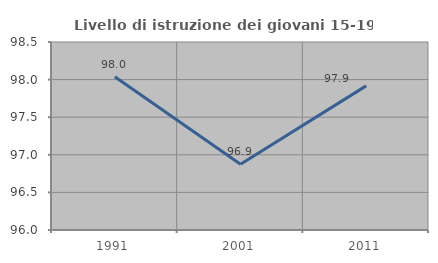
| Category | Livello di istruzione dei giovani 15-19 anni |
|---|---|
| 1991.0 | 98.039 |
| 2001.0 | 96.875 |
| 2011.0 | 97.917 |